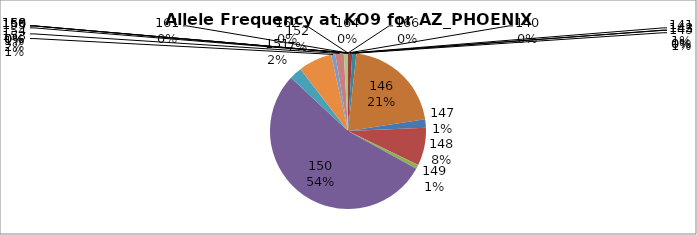
| Category | Series 0 |
|---|---|
| 140.0 | 0 |
| 141.0 | 0.009 |
| 142.0 | 0 |
| 143.0 | 0 |
| 145.0 | 0.009 |
| 146.0 | 0.209 |
| 147.0 | 0.017 |
| 148.0 | 0.078 |
| 149.0 | 0.009 |
| 150.0 | 0.539 |
| 151.0 | 0.026 |
| 152.0 | 0.07 |
| 153.0 | 0.009 |
| 154.0 | 0.017 |
| 155.0 | 0.009 |
| 156.0 | 0 |
| 158.0 | 0 |
| 160.0 | 0 |
| 161.0 | 0 |
| 162.0 | 0 |
| 164.0 | 0 |
| 166.0 | 0 |